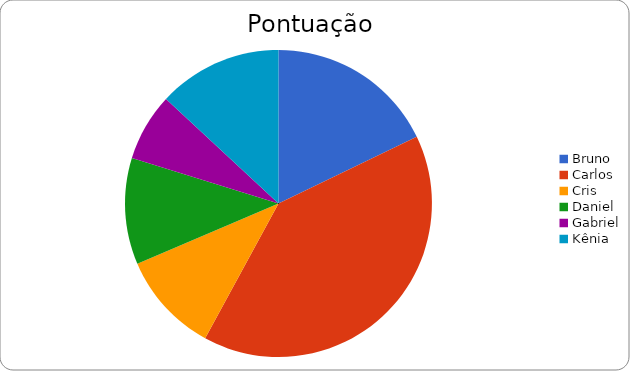
| Category | Pontuação |
|---|---|
| Bruno | 156.83 |
| Carlos | 352 |
| Cris | 93.5 |
| Daniel | 98.5 |
| Gabriel | 62.6 |
| Kênia | 115 |